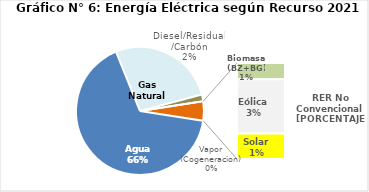
| Category | Series 0 |
|---|---|
| Agua | 3275.229 |
| Gas Natural | 1331.462 |
| Diesel/Residual/Carbón | 82.887 |
| Vapor (Cogeneracion) | 0.221 |
| Biomasa (BZ+BG) | 41.001 |
| Eólica | 135.947 |
| Solar | 63.765 |